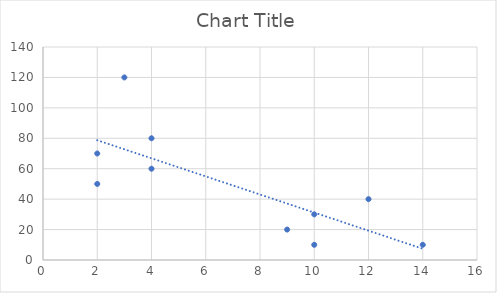
| Category | Series 0 |
|---|---|
| 10.0 | 30 |
| 9.0 | 20 |
| 4.0 | 60 |
| 2.0 | 70 |
| 3.0 | 120 |
| 4.0 | 80 |
| 2.0 | 50 |
| 12.0 | 40 |
| 10.0 | 10 |
| 14.0 | 10 |